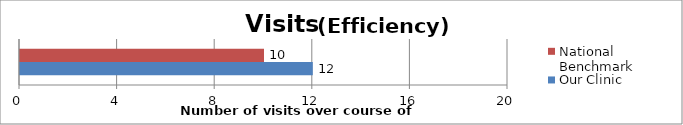
| Category | Our Clinic   | National Benchmark   |
|---|---|---|
| 0 | 12 | 10 |